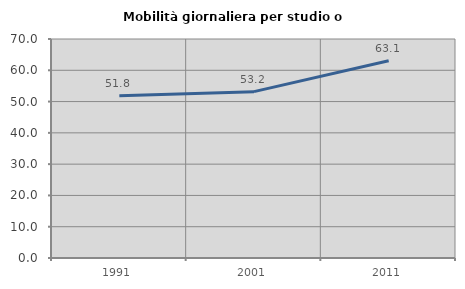
| Category | Mobilità giornaliera per studio o lavoro |
|---|---|
| 1991.0 | 51.845 |
| 2001.0 | 53.172 |
| 2011.0 | 63.059 |